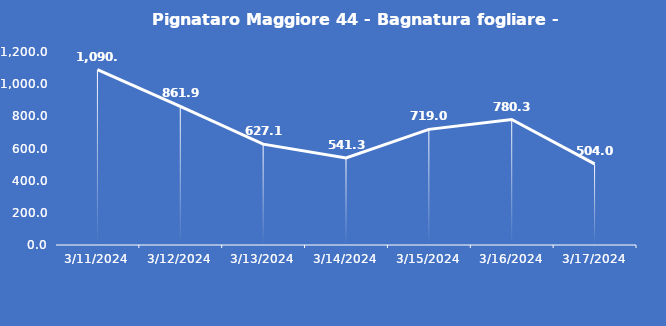
| Category | Pignataro Maggiore 44 - Bagnatura fogliare - Grezzo (min) |
|---|---|
| 3/11/24 | 1090.6 |
| 3/12/24 | 861.9 |
| 3/13/24 | 627.1 |
| 3/14/24 | 541.3 |
| 3/15/24 | 719 |
| 3/16/24 | 780.3 |
| 3/17/24 | 504 |